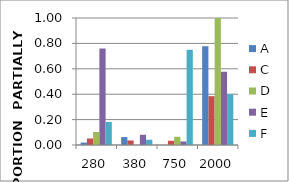
| Category | A | C | D | E | F |
|---|---|---|---|---|---|
| 280.0 | 0.019 | 0.051 | 0.103 | 0.76 | 0.182 |
| 380.0 | 0.062 | 0.036 | 0 | 0.081 | 0.042 |
| 750.0 | 0 | 0.033 | 0.065 | 0.028 | 0.75 |
| 2000.0 | 0.778 | 0.385 | 1 | 0.577 | 0.4 |